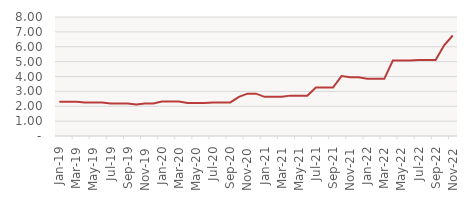
| Category | Sumas |
|---|---|
| 2019-01-01 | 2.299 |
| 2019-02-01 | 2.299 |
| 2019-03-01 | 2.299 |
| 2019-04-01 | 2.259 |
| 2019-05-01 | 2.259 |
| 2019-06-01 | 2.259 |
| 2019-07-01 | 2.19 |
| 2019-08-01 | 2.19 |
| 2019-09-01 | 2.19 |
| 2019-10-01 | 2.119 |
| 2019-11-01 | 2.185 |
| 2019-12-01 | 2.185 |
| 2020-01-01 | 2.313 |
| 2020-02-01 | 2.313 |
| 2020-03-01 | 2.313 |
| 2020-04-01 | 2.227 |
| 2020-05-01 | 2.227 |
| 2020-06-01 | 2.227 |
| 2020-07-01 | 2.258 |
| 2020-08-01 | 2.258 |
| 2020-09-01 | 2.258 |
| 2020-10-01 | 2.629 |
| 2020-11-01 | 2.847 |
| 2020-12-01 | 2.847 |
| 2021-01-01 | 2.632 |
| 2021-02-01 | 2.632 |
| 2021-03-01 | 2.632 |
| 2021-04-01 | 2.714 |
| 2021-05-01 | 2.714 |
| 2021-06-01 | 2.714 |
| 2021-07-01 | 3.261 |
| 2021-08-01 | 3.261 |
| 2021-09-01 | 3.261 |
| 2021-10-01 | 4.028 |
| 2021-11-01 | 3.946 |
| 2021-12-01 | 3.946 |
| 2022-01-01 | 3.845 |
| 2022-02-01 | 3.845 |
| 2022-03-01 | 3.845 |
| 2022-04-01 | 5.078 |
| 2022-05-01 | 5.078 |
| 2022-06-01 | 5.078 |
| 2022-07-01 | 5.105 |
| 2022-08-01 | 5.105 |
| 2022-09-01 | 5.105 |
| 2022-10-01 | 6.093 |
| 2022-11-01 | 6.756 |